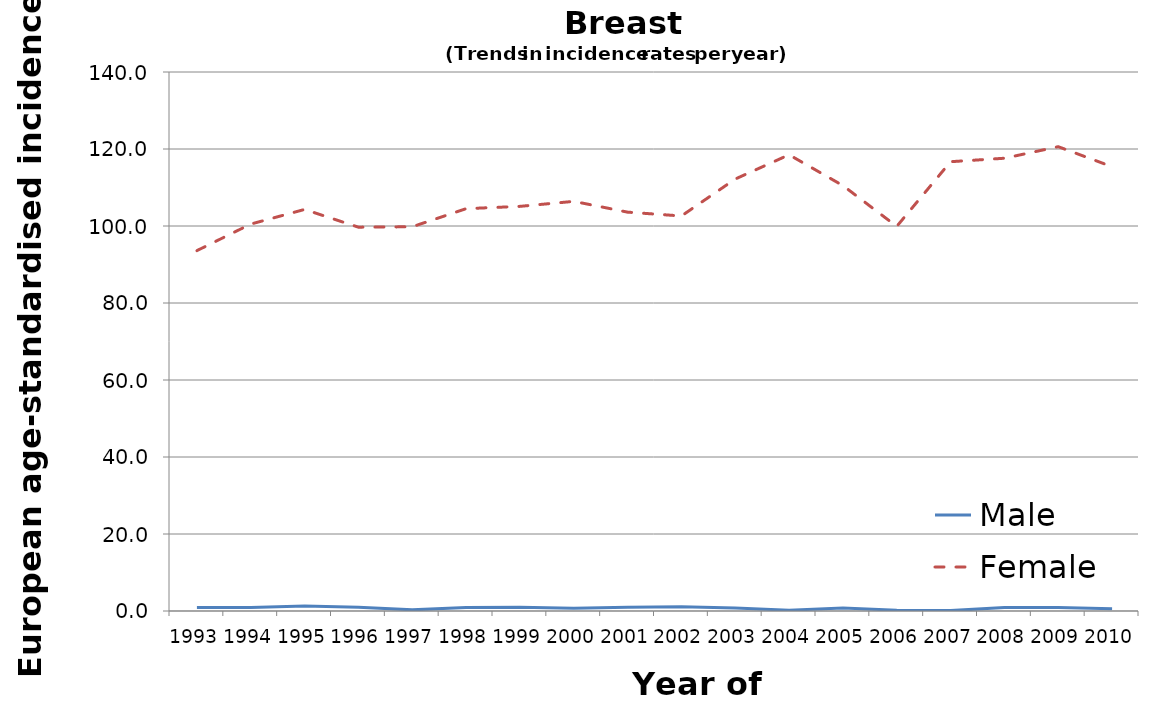
| Category | Male | Female |
|---|---|---|
| 1993.0 | 0.9 | 93.6 |
| 1994.0 | 0.9 | 100.5 |
| 1995.0 | 1.3 | 104.3 |
| 1996.0 | 1 | 99.7 |
| 1997.0 | 0.3 | 99.8 |
| 1998.0 | 0.9 | 104.5 |
| 1999.0 | 1 | 105.1 |
| 2000.0 | 0.7 | 106.4 |
| 2001.0 | 1 | 103.6 |
| 2002.0 | 1.1 | 102.6 |
| 2003.0 | 0.8 | 112.2 |
| 2004.0 | 0.2 | 118.5 |
| 2005.0 | 0.8 | 110.5 |
| 2006.0 | 0.2 | 99.9 |
| 2007.0 | 0.1 | 116.7 |
| 2008.0 | 0.9 | 117.6 |
| 2009.0 | 0.9 | 120.6 |
| 2010.0 | 0.6 | 115.4 |